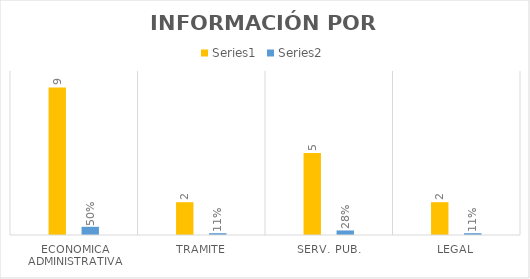
| Category | Series 3 | Series 4 |
|---|---|---|
| ECONOMICA ADMINISTRATIVA | 9 | 0.5 |
| TRAMITE | 2 | 0.111 |
| SERV. PUB. | 5 | 0.278 |
| LEGAL | 2 | 0.111 |